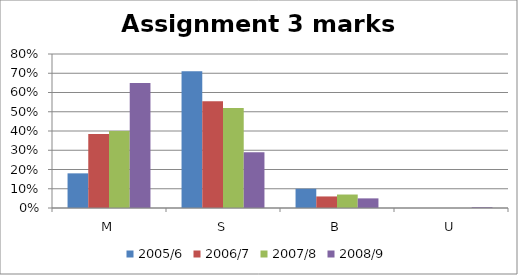
| Category | 2005/6 | 2006/7 | 2007/8 | 2008/9 |
|---|---|---|---|---|
| M | 0.18 | 0.385 | 0.4 | 0.65 |
| S | 0.71 | 0.555 | 0.52 | 0.29 |
| B | 0.1 | 0.06 | 0.07 | 0.05 |
| U | 0 | 0 | 0 | 0.004 |